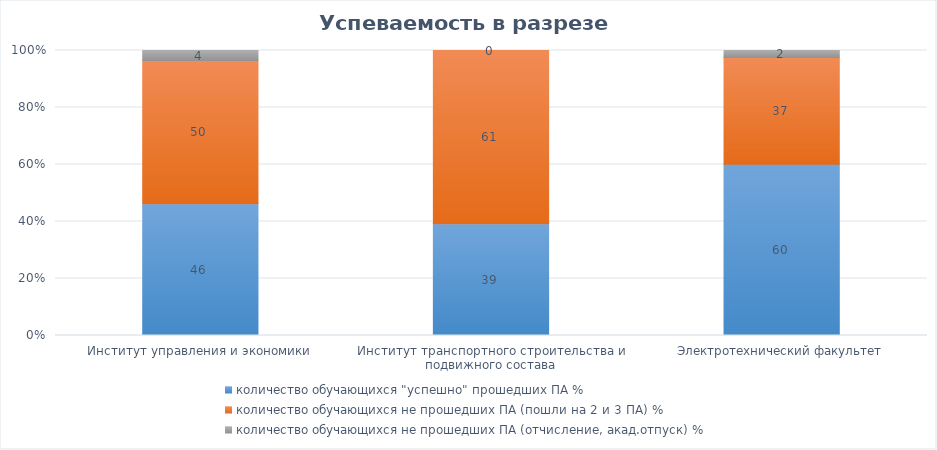
| Category | количество обучающихся "успешно" прошедших ПА % | количество обучающихся не прошедших ПА (пошли на 2 и 3 ПА) % | количество обучающихся не прошедших ПА (отчисление, акад.отпуск) % |
|---|---|---|---|
| Институт управления и экономики | 46.206 | 50.17 | 3.624 |
| Институт транспортного строительства и подвижного состава | 39.185 | 60.815 | 0 |
| Электротехнический факультет | 60.109 | 37.449 | 2.442 |